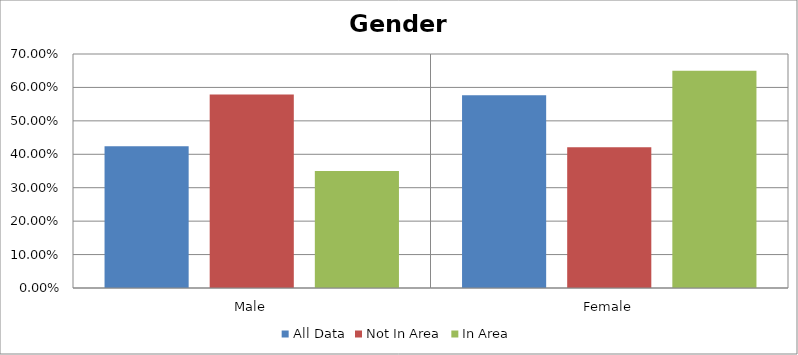
| Category | All Data | Not In Area | In Area |
|---|---|---|---|
| Male | 0.424 | 0.579 | 0.35 |
| Female | 0.576 | 0.421 | 0.65 |